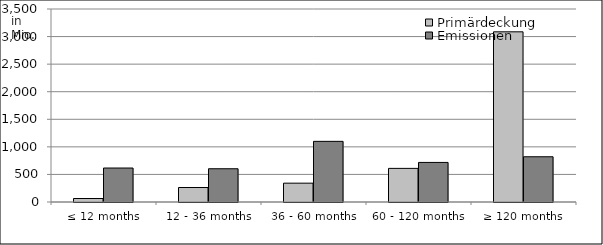
| Category | Primärdeckung | Emissionen |
|---|---|---|
| ≤ 12 months | 63387682.28 | 616030554.481 |
| 12 - 36 months | 262934170.81 | 603000000 |
| 36 - 60 months | 341693139.419 | 1099721378.63 |
| 60 - 120 months | 609669868.427 | 717650000 |
| ≥ 120 months | 3086259589.418 | 820585464.34 |